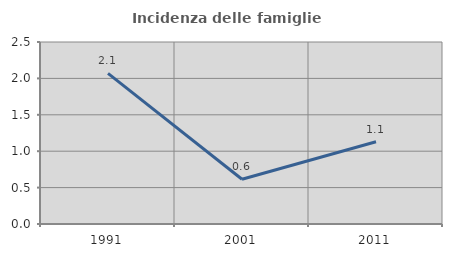
| Category | Incidenza delle famiglie numerose |
|---|---|
| 1991.0 | 2.069 |
| 2001.0 | 0.615 |
| 2011.0 | 1.13 |